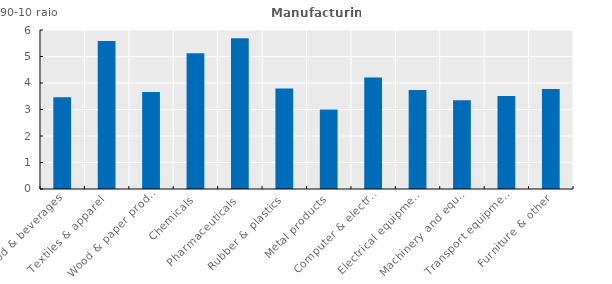
| Category | Series 0 |
|---|---|
| Food & beverages | 3.464 |
| Textiles & apparel  | 5.584 |
| Wood & paper prod.  | 3.665 |
| Chemicals | 5.123 |
| Pharmaceuticals  | 5.692 |
| Rubber & plastics  | 3.788 |
| Metal products | 3.003 |
| Computer & electronics  | 4.206 |
| Electrical equipment | 3.74 |
| Machinery and equipment | 3.347 |
| Transport equipment  | 3.507 |
| Furniture & other | 3.774 |